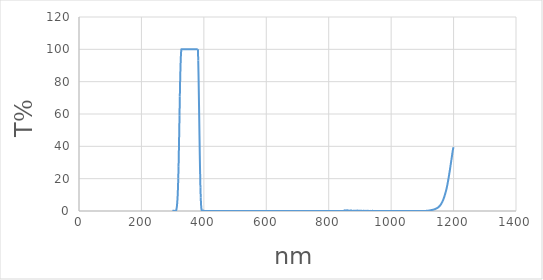
| Category | Series 0 |
|---|---|
| 1200.0 | 39.42 |
| 1199.0 | 38.84 |
| 1198.0 | 37.97 |
| 1197.0 | 36.85 |
| 1196.0 | 35.57 |
| 1195.0 | 34.21 |
| 1194.0 | 32.86 |
| 1193.0 | 31.59 |
| 1192.0 | 30.35 |
| 1191.0 | 29 |
| 1190.0 | 27.67 |
| 1189.0 | 26.37 |
| 1188.0 | 25.1 |
| 1187.0 | 23.88 |
| 1186.0 | 22.69 |
| 1185.0 | 21.53 |
| 1184.0 | 20.39 |
| 1183.0 | 19.27 |
| 1182.0 | 18.17 |
| 1181.0 | 17.11 |
| 1180.0 | 16.08 |
| 1179.0 | 15.14 |
| 1178.0 | 14.26 |
| 1177.0 | 13.43 |
| 1176.0 | 12.66 |
| 1175.0 | 11.92 |
| 1174.0 | 11.23 |
| 1173.0 | 10.54 |
| 1172.0 | 9.89 |
| 1171.0 | 9.24 |
| 1170.0 | 8.63 |
| 1169.0 | 8.07 |
| 1168.0 | 7.54 |
| 1167.0 | 7.04 |
| 1166.0 | 6.57 |
| 1165.0 | 6.14 |
| 1164.0 | 5.73 |
| 1163.0 | 5.35 |
| 1162.0 | 4.98 |
| 1161.0 | 4.63 |
| 1160.0 | 4.31 |
| 1159.0 | 4.01 |
| 1158.0 | 3.73 |
| 1157.0 | 3.48 |
| 1156.0 | 3.23 |
| 1155.0 | 3.02 |
| 1154.0 | 2.81 |
| 1153.0 | 2.63 |
| 1152.0 | 2.46 |
| 1151.0 | 2.3 |
| 1150.0 | 2.14 |
| 1149.0 | 2.01 |
| 1148.0 | 1.88 |
| 1147.0 | 1.77 |
| 1146.0 | 1.66 |
| 1145.0 | 1.56 |
| 1144.0 | 1.46 |
| 1143.0 | 1.37 |
| 1142.0 | 1.28 |
| 1141.0 | 1.2 |
| 1140.0 | 1.12 |
| 1139.0 | 1.05 |
| 1138.0 | 1 |
| 1137.0 | 0.95 |
| 1136.0 | 0.89 |
| 1135.0 | 0.84 |
| 1134.0 | 0.79 |
| 1133.0 | 0.74 |
| 1132.0 | 0.7 |
| 1131.0 | 0.64 |
| 1130.0 | 0.6 |
| 1129.0 | 0.57 |
| 1128.0 | 0.54 |
| 1127.0 | 0.5 |
| 1126.0 | 0.46 |
| 1125.0 | 0.41 |
| 1124.0 | 0.37 |
| 1123.0 | 0.32 |
| 1122.0 | 0.29 |
| 1121.0 | 0.26 |
| 1120.0 | 0.24 |
| 1119.0 | 0.22 |
| 1118.0 | 0.21 |
| 1117.0 | 0.19 |
| 1116.0 | 0.18 |
| 1115.0 | 0.16 |
| 1114.0 | 0.13 |
| 1113.0 | 0.11 |
| 1112.0 | 0.08 |
| 1111.0 | 0.07 |
| 1110.0 | 0.06 |
| 1109.0 | 0.05 |
| 1108.0 | 0.05 |
| 1107.0 | 0.06 |
| 1106.0 | 0.06 |
| 1105.0 | 0.05 |
| 1104.0 | 0.04 |
| 1103.0 | 0.02 |
| 1102.0 | 0.01 |
| 1101.0 | 0 |
| 1100.0 | 0.01 |
| 1099.0 | 0 |
| 1098.0 | 0 |
| 1097.0 | 0.01 |
| 1096.0 | 0.02 |
| 1095.0 | 0.03 |
| 1094.0 | 0.04 |
| 1093.0 | 0.04 |
| 1092.0 | 0.04 |
| 1091.0 | 0.03 |
| 1090.0 | 0.02 |
| 1089.0 | 0.02 |
| 1088.0 | 0.02 |
| 1087.0 | 0.01 |
| 1086.0 | 0.01 |
| 1085.0 | 0.02 |
| 1084.0 | 0.02 |
| 1083.0 | 0.02 |
| 1082.0 | 0.02 |
| 1081.0 | 0.02 |
| 1080.0 | 0.01 |
| 1079.0 | 0.01 |
| 1078.0 | 0 |
| 1077.0 | 0.01 |
| 1076.0 | 0.01 |
| 1075.0 | 0.02 |
| 1074.0 | 0.02 |
| 1073.0 | 0.01 |
| 1072.0 | 0.01 |
| 1071.0 | 0.01 |
| 1070.0 | 0.01 |
| 1069.0 | 0.01 |
| 1068.0 | 0.01 |
| 1067.0 | 0.01 |
| 1066.0 | 0 |
| 1065.0 | 0.01 |
| 1064.0 | 0.01 |
| 1063.0 | 0.02 |
| 1062.0 | 0.03 |
| 1061.0 | 0.03 |
| 1060.0 | 0.02 |
| 1059.0 | 0.02 |
| 1058.0 | 0.01 |
| 1057.0 | 0 |
| 1056.0 | 0.01 |
| 1055.0 | 0.02 |
| 1054.0 | 0.02 |
| 1053.0 | 0.02 |
| 1052.0 | 0.01 |
| 1051.0 | 0.01 |
| 1050.0 | 0.02 |
| 1049.0 | 0.01 |
| 1048.0 | 0 |
| 1047.0 | 0.01 |
| 1046.0 | 0.01 |
| 1045.0 | 0 |
| 1044.0 | 0.01 |
| 1043.0 | 0.02 |
| 1042.0 | 0.03 |
| 1041.0 | 0.03 |
| 1040.0 | 0.03 |
| 1039.0 | 0.02 |
| 1038.0 | 0.01 |
| 1037.0 | 0 |
| 1036.0 | 0 |
| 1035.0 | 0 |
| 1034.0 | 0.02 |
| 1033.0 | 0.04 |
| 1032.0 | 0.05 |
| 1031.0 | 0.05 |
| 1030.0 | 0.05 |
| 1029.0 | 0.05 |
| 1028.0 | 0.04 |
| 1027.0 | 0.03 |
| 1026.0 | 0.02 |
| 1025.0 | 0.03 |
| 1024.0 | 0.02 |
| 1023.0 | 0.03 |
| 1022.0 | 0.02 |
| 1021.0 | 0.01 |
| 1020.0 | 0 |
| 1019.0 | 0.01 |
| 1018.0 | 0.01 |
| 1017.0 | 0.01 |
| 1016.0 | 0.02 |
| 1015.0 | 0.02 |
| 1014.0 | 0.03 |
| 1013.0 | 0.04 |
| 1012.0 | 0.05 |
| 1011.0 | 0.06 |
| 1010.0 | 0.06 |
| 1009.0 | 0.06 |
| 1008.0 | 0.05 |
| 1007.0 | 0.03 |
| 1006.0 | 0.03 |
| 1005.0 | 0.04 |
| 1004.0 | 0.04 |
| 1003.0 | 0.03 |
| 1002.0 | 0.03 |
| 1001.0 | 0.03 |
| 1000.0 | 0.01 |
| 999.0 | 0.01 |
| 998.0 | 0 |
| 997.0 | 0.01 |
| 996.0 | 0.01 |
| 995.0 | 0.02 |
| 994.0 | 0 |
| 993.0 | 0.01 |
| 992.0 | 0.01 |
| 991.0 | 0.01 |
| 990.0 | 0.02 |
| 989.0 | 0.02 |
| 988.0 | 0.04 |
| 987.0 | 0.04 |
| 986.0 | 0.02 |
| 985.0 | 0.01 |
| 984.0 | 0.01 |
| 983.0 | 0 |
| 982.0 | 0.01 |
| 981.0 | 0.01 |
| 980.0 | 0.01 |
| 979.0 | 0.02 |
| 978.0 | 0.03 |
| 977.0 | 0.03 |
| 976.0 | 0.02 |
| 975.0 | 0.02 |
| 974.0 | 0 |
| 973.0 | 0.02 |
| 972.0 | 0.03 |
| 971.0 | 0.01 |
| 970.0 | 0.01 |
| 969.0 | 0.05 |
| 968.0 | 0.04 |
| 967.0 | 0.04 |
| 966.0 | 0.03 |
| 965.0 | 0.04 |
| 964.0 | 0.04 |
| 963.0 | 0.03 |
| 962.0 | 0.03 |
| 961.0 | 0.04 |
| 960.0 | 0.02 |
| 959.0 | 0 |
| 958.0 | 0.02 |
| 957.0 | 0.01 |
| 956.0 | 0.03 |
| 955.0 | 0.05 |
| 954.0 | 0.05 |
| 953.0 | 0.06 |
| 952.0 | 0.06 |
| 951.0 | 0.04 |
| 950.0 | 0.04 |
| 949.0 | 0.02 |
| 948.0 | 0.03 |
| 947.0 | 0.04 |
| 946.0 | 0.04 |
| 945.0 | 0.04 |
| 944.0 | 0.03 |
| 943.0 | 0.06 |
| 942.0 | 0.07 |
| 941.0 | 0.09 |
| 940.0 | 0.09 |
| 939.0 | 0.08 |
| 938.0 | 0.07 |
| 937.0 | 0.06 |
| 936.0 | 0.06 |
| 935.0 | 0.07 |
| 934.0 | 0.08 |
| 933.0 | 0.05 |
| 932.0 | 0.05 |
| 931.0 | 0.04 |
| 930.0 | 0.03 |
| 929.0 | 0.07 |
| 928.0 | 0.07 |
| 927.0 | 0.09 |
| 926.0 | 0.1 |
| 925.0 | 0.09 |
| 924.0 | 0.09 |
| 923.0 | 0.07 |
| 922.0 | 0.06 |
| 921.0 | 0.07 |
| 920.0 | 0.1 |
| 919.0 | 0.07 |
| 918.0 | 0.08 |
| 917.0 | 0.06 |
| 916.0 | 0.05 |
| 915.0 | 0.06 |
| 914.0 | 0.1 |
| 913.0 | 0.14 |
| 912.0 | 0.17 |
| 911.0 | 0.15 |
| 910.0 | 0.12 |
| 909.0 | 0.06 |
| 908.0 | 0.03 |
| 907.0 | 0.02 |
| 906.0 | 0.09 |
| 905.0 | 0.1 |
| 904.0 | 0.15 |
| 903.0 | 0.21 |
| 902.0 | 0.23 |
| 901.0 | 0.18 |
| 900.0 | 0.14 |
| 899.0 | 0.11 |
| 898.0 | 0.08 |
| 897.0 | 0.09 |
| 896.0 | 0.15 |
| 895.0 | 0.19 |
| 894.0 | 0.18 |
| 893.0 | 0.23 |
| 892.0 | 0.27 |
| 891.0 | 0.27 |
| 890.0 | 0.22 |
| 889.0 | 0.17 |
| 888.0 | 0.14 |
| 887.0 | 0.11 |
| 886.0 | 0.11 |
| 885.0 | 0.16 |
| 884.0 | 0.16 |
| 883.0 | 0.22 |
| 882.0 | 0.2 |
| 881.0 | 0.19 |
| 880.0 | 0.15 |
| 879.0 | 0.12 |
| 878.0 | 0.05 |
| 877.0 | 0.07 |
| 876.0 | 0.08 |
| 875.0 | 0.13 |
| 874.0 | 0.24 |
| 873.0 | 0.3 |
| 872.0 | 0.33 |
| 871.0 | 0.34 |
| 870.0 | 0.25 |
| 869.0 | 0.29 |
| 868.0 | 0.21 |
| 867.0 | 0.19 |
| 866.0 | 0.22 |
| 865.0 | 0.19 |
| 864.0 | 0.18 |
| 863.0 | 0.26 |
| 862.0 | 0.29 |
| 861.0 | 0.3 |
| 860.0 | 0.4 |
| 859.0 | 0.4 |
| 858.0 | 0.41 |
| 857.0 | 0.35 |
| 856.0 | 0.22 |
| 855.0 | 0.23 |
| 854.0 | 0.27 |
| 853.0 | 0.34 |
| 852.0 | 0.41 |
| 851.0 | 0.37 |
| 850.0 | 0.28 |
| 849.0 | 0.21 |
| 848.0 | 0.09 |
| 847.0 | 0.03 |
| 846.0 | 0.05 |
| 845.0 | 0.04 |
| 844.0 | 0.04 |
| 843.0 | 0.03 |
| 842.0 | 0.02 |
| 841.0 | 0.01 |
| 840.0 | 0.02 |
| 839.0 | 0 |
| 838.0 | 0.01 |
| 837.0 | 0.01 |
| 836.0 | 0.03 |
| 835.0 | 0.03 |
| 834.0 | 0.04 |
| 833.0 | 0.03 |
| 832.0 | 0.02 |
| 831.0 | 0.02 |
| 830.0 | 0.01 |
| 829.0 | 0 |
| 828.0 | 0 |
| 827.0 | 0.01 |
| 826.0 | 0 |
| 825.0 | 0 |
| 824.0 | 0.01 |
| 823.0 | 0.02 |
| 822.0 | 0.02 |
| 821.0 | 0.02 |
| 820.0 | 0.02 |
| 819.0 | 0.02 |
| 818.0 | 0.01 |
| 817.0 | 0.01 |
| 816.0 | 0.02 |
| 815.0 | 0.02 |
| 814.0 | 0.02 |
| 813.0 | 0.02 |
| 812.0 | 0.02 |
| 811.0 | 0.01 |
| 810.0 | 0.01 |
| 809.0 | 0.02 |
| 808.0 | 0.01 |
| 807.0 | 0 |
| 806.0 | 0 |
| 805.0 | 0 |
| 804.0 | 0 |
| 803.0 | 0.01 |
| 802.0 | 0 |
| 801.0 | 0.01 |
| 800.0 | 0.02 |
| 799.0 | 0.02 |
| 798.0 | 0.03 |
| 797.0 | 0.03 |
| 796.0 | 0.03 |
| 795.0 | 0.03 |
| 794.0 | 0.02 |
| 793.0 | 0.01 |
| 792.0 | 0.01 |
| 791.0 | 0.01 |
| 790.0 | 0 |
| 789.0 | 0 |
| 788.0 | 0.01 |
| 787.0 | 0.01 |
| 786.0 | 0.01 |
| 785.0 | 0.01 |
| 784.0 | 0.01 |
| 783.0 | 0.02 |
| 782.0 | 0.01 |
| 781.0 | 0.01 |
| 780.0 | 0.01 |
| 779.0 | 0 |
| 778.0 | 0 |
| 777.0 | 0 |
| 776.0 | 0 |
| 775.0 | 0 |
| 774.0 | 0 |
| 773.0 | 0.01 |
| 772.0 | 0.01 |
| 771.0 | 0.01 |
| 770.0 | 0.01 |
| 769.0 | 0 |
| 768.0 | 0 |
| 767.0 | 0 |
| 766.0 | 0 |
| 765.0 | 0.01 |
| 764.0 | 0.01 |
| 763.0 | 0.01 |
| 762.0 | 0.01 |
| 761.0 | 0.01 |
| 760.0 | 0.01 |
| 759.0 | 0 |
| 758.0 | 0.01 |
| 757.0 | 0.01 |
| 756.0 | 0.02 |
| 755.0 | 0.02 |
| 754.0 | 0.02 |
| 753.0 | 0.01 |
| 752.0 | 0.01 |
| 751.0 | 0.01 |
| 750.0 | 0.01 |
| 749.0 | 0.01 |
| 748.0 | 0.01 |
| 747.0 | 0.01 |
| 746.0 | 0.01 |
| 745.0 | 0.01 |
| 744.0 | 0.01 |
| 743.0 | 0.01 |
| 742.0 | 0.01 |
| 741.0 | 0.01 |
| 740.0 | 0.01 |
| 739.0 | 0.01 |
| 738.0 | 0.01 |
| 737.0 | 0.01 |
| 736.0 | 0.02 |
| 735.0 | 0.02 |
| 734.0 | 0.02 |
| 733.0 | 0.02 |
| 732.0 | 0.01 |
| 731.0 | 0.01 |
| 730.0 | 0.01 |
| 729.0 | 0.01 |
| 728.0 | 0.01 |
| 727.0 | 0.01 |
| 726.0 | 0.01 |
| 725.0 | 0.01 |
| 724.0 | 0.01 |
| 723.0 | 0.01 |
| 722.0 | 0.01 |
| 721.0 | 0.01 |
| 720.0 | 0.02 |
| 719.0 | 0.01 |
| 718.0 | 0.01 |
| 717.0 | 0.01 |
| 716.0 | 0.01 |
| 715.0 | 0.01 |
| 714.0 | 0.01 |
| 713.0 | 0.02 |
| 712.0 | 0.02 |
| 711.0 | 0.02 |
| 710.0 | 0.01 |
| 709.0 | 0.01 |
| 708.0 | 0.01 |
| 707.0 | 0.01 |
| 706.0 | 0.01 |
| 705.0 | 0.01 |
| 704.0 | 0.01 |
| 703.0 | 0.01 |
| 702.0 | 0.01 |
| 701.0 | 0.01 |
| 700.0 | 0.01 |
| 699.0 | 0.01 |
| 698.0 | 0.01 |
| 697.0 | 0.01 |
| 696.0 | 0.01 |
| 695.0 | 0.01 |
| 694.0 | 0.01 |
| 693.0 | 0.01 |
| 692.0 | 0.01 |
| 691.0 | 0.01 |
| 690.0 | 0.01 |
| 689.0 | 0.01 |
| 688.0 | 0.01 |
| 687.0 | 0.01 |
| 686.0 | 0.01 |
| 685.0 | 0.01 |
| 684.0 | 0.01 |
| 683.0 | 0.01 |
| 682.0 | 0.01 |
| 681.0 | 0.01 |
| 680.0 | 0.01 |
| 679.0 | 0 |
| 678.0 | 0 |
| 677.0 | 0 |
| 676.0 | 0 |
| 675.0 | 0 |
| 674.0 | 0 |
| 673.0 | 0 |
| 672.0 | 0 |
| 671.0 | 0 |
| 670.0 | 0 |
| 669.0 | 0 |
| 668.0 | 0 |
| 667.0 | 0.01 |
| 666.0 | 0.01 |
| 665.0 | 0.01 |
| 664.0 | 0.01 |
| 663.0 | 0.02 |
| 662.0 | 0.02 |
| 661.0 | 0.03 |
| 660.0 | 0.03 |
| 659.0 | 0.03 |
| 658.0 | 0.03 |
| 657.0 | 0.03 |
| 656.0 | 0.03 |
| 655.0 | 0.03 |
| 654.0 | 0.02 |
| 653.0 | 0.02 |
| 652.0 | 0.02 |
| 651.0 | 0.02 |
| 650.0 | 0.02 |
| 649.0 | 0.02 |
| 648.0 | 0.02 |
| 647.0 | 0.01 |
| 646.0 | 0.01 |
| 645.0 | 0.01 |
| 644.0 | 0.01 |
| 643.0 | 0.01 |
| 642.0 | 0.01 |
| 641.0 | 0.01 |
| 640.0 | 0.01 |
| 639.0 | 0.01 |
| 638.0 | 0.01 |
| 637.0 | 0.01 |
| 636.0 | 0.01 |
| 635.0 | 0.01 |
| 634.0 | 0.01 |
| 633.0 | 0.01 |
| 632.0 | 0.02 |
| 631.0 | 0.02 |
| 630.0 | 0.02 |
| 629.0 | 0.02 |
| 628.0 | 0.02 |
| 627.0 | 0.02 |
| 626.0 | 0.02 |
| 625.0 | 0.02 |
| 624.0 | 0.02 |
| 623.0 | 0.02 |
| 622.0 | 0.02 |
| 621.0 | 0.02 |
| 620.0 | 0.02 |
| 619.0 | 0.02 |
| 618.0 | 0.01 |
| 617.0 | 0.01 |
| 616.0 | 0.01 |
| 615.0 | 0.01 |
| 614.0 | 0.01 |
| 613.0 | 0.01 |
| 612.0 | 0.01 |
| 611.0 | 0.01 |
| 610.0 | 0.01 |
| 609.0 | 0.02 |
| 608.0 | 0.02 |
| 607.0 | 0.02 |
| 606.0 | 0.02 |
| 605.0 | 0.02 |
| 604.0 | 0.02 |
| 603.0 | 0.02 |
| 602.0 | 0.02 |
| 601.0 | 0.02 |
| 600.0 | 0.01 |
| 599.0 | 0.01 |
| 598.0 | 0.01 |
| 597.0 | 0.01 |
| 596.0 | 0.01 |
| 595.0 | 0.01 |
| 594.0 | 0.01 |
| 593.0 | 0.01 |
| 592.0 | 0.01 |
| 591.0 | 0.01 |
| 590.0 | 0.01 |
| 589.0 | 0.01 |
| 588.0 | 0.01 |
| 587.0 | 0.01 |
| 586.0 | 0.01 |
| 585.0 | 0.01 |
| 584.0 | 0.02 |
| 583.0 | 0.02 |
| 582.0 | 0.02 |
| 581.0 | 0.01 |
| 580.0 | 0.01 |
| 579.0 | 0.01 |
| 578.0 | 0.01 |
| 577.0 | 0.02 |
| 576.0 | 0.02 |
| 575.0 | 0.02 |
| 574.0 | 0.02 |
| 573.0 | 0.02 |
| 572.0 | 0.02 |
| 571.0 | 0.02 |
| 570.0 | 0.02 |
| 569.0 | 0.02 |
| 568.0 | 0.02 |
| 567.0 | 0.02 |
| 566.0 | 0.01 |
| 565.0 | 0.01 |
| 564.0 | 0.01 |
| 563.0 | 0.01 |
| 562.0 | 0.02 |
| 561.0 | 0.02 |
| 560.0 | 0.01 |
| 559.0 | 0.02 |
| 558.0 | 0.01 |
| 557.0 | 0.01 |
| 556.0 | 0.01 |
| 555.0 | 0.01 |
| 554.0 | 0.01 |
| 553.0 | 0.01 |
| 552.0 | 0.01 |
| 551.0 | 0.01 |
| 550.0 | 0.01 |
| 549.0 | 0.01 |
| 548.0 | 0.01 |
| 547.0 | 0.01 |
| 546.0 | 0.01 |
| 545.0 | 0.01 |
| 544.0 | 0.01 |
| 543.0 | 0.02 |
| 542.0 | 0.02 |
| 541.0 | 0.02 |
| 540.0 | 0.01 |
| 539.0 | 0.01 |
| 538.0 | 0.01 |
| 537.0 | 0.01 |
| 536.0 | 0.01 |
| 535.0 | 0.01 |
| 534.0 | 0.02 |
| 533.0 | 0.02 |
| 532.0 | 0.02 |
| 531.0 | 0.02 |
| 530.0 | 0.02 |
| 529.0 | 0.02 |
| 528.0 | 0.02 |
| 527.0 | 0.01 |
| 526.0 | 0.01 |
| 525.0 | 0.02 |
| 524.0 | 0.02 |
| 523.0 | 0.02 |
| 522.0 | 0.02 |
| 521.0 | 0.02 |
| 520.0 | 0.02 |
| 519.0 | 0.02 |
| 518.0 | 0.02 |
| 517.0 | 0.02 |
| 516.0 | 0.02 |
| 515.0 | 0.01 |
| 514.0 | 0.01 |
| 513.0 | 0.01 |
| 512.0 | 0.01 |
| 511.0 | 0.01 |
| 510.0 | 0.02 |
| 509.0 | 0.02 |
| 508.0 | 0.02 |
| 507.0 | 0.02 |
| 506.0 | 0.01 |
| 505.0 | 0.01 |
| 504.0 | 0.01 |
| 503.0 | 0.01 |
| 502.0 | 0.01 |
| 501.0 | 0.01 |
| 500.0 | 0.01 |
| 499.0 | 0.01 |
| 498.0 | 0.01 |
| 497.0 | 0.01 |
| 496.0 | 0.01 |
| 495.0 | 0.01 |
| 494.0 | 0.01 |
| 493.0 | 0.01 |
| 492.0 | 0.01 |
| 491.0 | 0.01 |
| 490.0 | 0 |
| 489.0 | 0 |
| 488.0 | 0 |
| 487.0 | 0.01 |
| 486.0 | 0.01 |
| 485.0 | 0.01 |
| 484.0 | 0.01 |
| 483.0 | 0.01 |
| 482.0 | 0.01 |
| 481.0 | 0.01 |
| 480.0 | 0.01 |
| 479.0 | 0.01 |
| 478.0 | 0.01 |
| 477.0 | 0.01 |
| 476.0 | 0.01 |
| 475.0 | 0.01 |
| 474.0 | 0.02 |
| 473.0 | 0.02 |
| 472.0 | 0.02 |
| 471.0 | 0.02 |
| 470.0 | 0.02 |
| 469.0 | 0.02 |
| 468.0 | 0.03 |
| 467.0 | 0.03 |
| 466.0 | 0.03 |
| 465.0 | 0.02 |
| 464.0 | 0.02 |
| 463.0 | 0.02 |
| 462.0 | 0.02 |
| 461.0 | 0.02 |
| 460.0 | 0.02 |
| 459.0 | 0.02 |
| 458.0 | 0.03 |
| 457.0 | 0.03 |
| 456.0 | 0.03 |
| 455.0 | 0.02 |
| 454.0 | 0.02 |
| 453.0 | 0.02 |
| 452.0 | 0.02 |
| 451.0 | 0.02 |
| 450.0 | 0.02 |
| 449.0 | 0.02 |
| 448.0 | 0.02 |
| 447.0 | 0.02 |
| 446.0 | 0.02 |
| 445.0 | 0.02 |
| 444.0 | 0.02 |
| 443.0 | 0.02 |
| 442.0 | 0.02 |
| 441.0 | 0.03 |
| 440.0 | 0.02 |
| 439.0 | 0.02 |
| 438.0 | 0.02 |
| 437.0 | 0.02 |
| 436.0 | 0.01 |
| 435.0 | 0.01 |
| 434.0 | 0.01 |
| 433.0 | 0.01 |
| 432.0 | 0.01 |
| 431.0 | 0.01 |
| 430.0 | 0.01 |
| 429.0 | 0.01 |
| 428.0 | 0.01 |
| 427.0 | 0.01 |
| 426.0 | 0.01 |
| 425.0 | 0.01 |
| 424.0 | 0.02 |
| 423.0 | 0.02 |
| 422.0 | 0.02 |
| 421.0 | 0.02 |
| 420.0 | 0.02 |
| 419.0 | 0.02 |
| 418.0 | 0.02 |
| 417.0 | 0.01 |
| 416.0 | 0.02 |
| 415.0 | 0.02 |
| 414.0 | 0.02 |
| 413.0 | 0.02 |
| 412.0 | 0.02 |
| 411.0 | 0.02 |
| 410.0 | 0.03 |
| 409.0 | 0.03 |
| 408.0 | 0.04 |
| 407.0 | 0.04 |
| 406.0 | 0.04 |
| 405.0 | 0.05 |
| 404.0 | 0.05 |
| 403.0 | 0.05 |
| 402.0 | 0.06 |
| 401.0 | 0.07 |
| 400.0 | 0.1 |
| 399.0 | 0.15 |
| 398.0 | 0.24 |
| 397.0 | 0.25 |
| 396.0 | 0.15 |
| 395.0 | 0.01 |
| 394.0 | 0.01 |
| 393.0 | 0.43 |
| 392.0 | 1.7 |
| 391.0 | 4.13 |
| 390.0 | 8.32 |
| 389.0 | 14.72 |
| 388.0 | 23.48 |
| 387.0 | 34.26 |
| 386.0 | 46.54 |
| 385.0 | 59.23 |
| 384.0 | 71.8 |
| 383.0 | 83.41 |
| 382.0 | 93.07 |
| 381.0 | 100 |
| 380.0 | 100 |
| 379.0 | 100 |
| 378.0 | 100 |
| 377.0 | 100 |
| 376.0 | 100 |
| 375.0 | 100 |
| 374.0 | 100 |
| 373.0 | 100 |
| 372.0 | 100 |
| 371.0 | 100 |
| 370.0 | 100 |
| 369.0 | 100 |
| 368.0 | 100 |
| 367.0 | 100 |
| 366.0 | 100 |
| 365.0 | 100 |
| 364.0 | 100 |
| 363.0 | 100 |
| 362.0 | 100 |
| 361.0 | 100 |
| 360.0 | 100 |
| 359.0 | 100 |
| 358.0 | 100 |
| 357.0 | 100 |
| 356.0 | 100 |
| 355.0 | 100 |
| 354.0 | 100 |
| 353.0 | 100 |
| 352.0 | 100 |
| 351.0 | 100 |
| 350.0 | 100 |
| 349.0 | 100 |
| 348.0 | 100 |
| 347.0 | 100 |
| 346.0 | 100 |
| 345.0 | 100 |
| 344.0 | 100 |
| 343.0 | 100 |
| 342.0 | 100 |
| 341.0 | 100 |
| 340.0 | 100 |
| 339.0 | 100 |
| 338.0 | 100 |
| 337.0 | 100 |
| 336.0 | 100 |
| 335.0 | 100 |
| 334.0 | 100 |
| 333.0 | 100 |
| 332.0 | 100 |
| 331.0 | 100 |
| 330.0 | 100 |
| 329.0 | 100 |
| 328.0 | 100 |
| 327.0 | 97.95 |
| 326.0 | 94.04 |
| 325.0 | 87.95 |
| 324.0 | 80.34 |
| 323.0 | 70.89 |
| 322.0 | 58.95 |
| 321.0 | 47.88 |
| 320.0 | 37.64 |
| 319.0 | 27.75 |
| 318.0 | 20.15 |
| 317.0 | 13.83 |
| 316.0 | 9.29 |
| 315.0 | 5.94 |
| 314.0 | 3.56 |
| 313.0 | 1.98 |
| 312.0 | 0.84 |
| 311.0 | 0.27 |
| 310.0 | 0.07 |
| 309.0 | 0.05 |
| 308.0 | 0.09 |
| 307.0 | 0.11 |
| 306.0 | 0.02 |
| 305.0 | 0.02 |
| 304.0 | 0.07 |
| 303.0 | 0.14 |
| 302.0 | 0.17 |
| 301.0 | 0.13 |
| 300.0 | 0.03 |